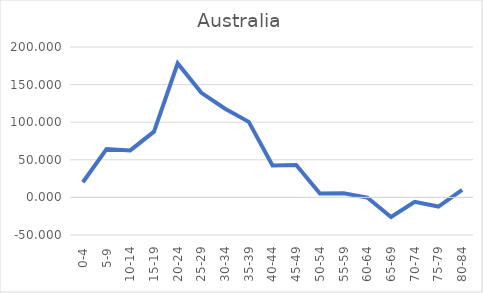
| Category | Series 0 |
|---|---|
| 0-4 | 20.117 |
| 5-9 | 64.284 |
| 10-14 | 62.511 |
| 15-19 | 87.4 |
| 20-24 | 178.189 |
| 25-29 | 139.024 |
| 30-34 | 117.969 |
| 35-39 | 100.443 |
| 40-44 | 42.534 |
| 45-49 | 43.114 |
| 50-54 | 5.261 |
| 55-59 | 5.458 |
| 60-64 | -0.158 |
| 65-69 | -26.077 |
| 70-74 | -5.917 |
| 75-79 | -12.198 |
| 80-84 | 9.963 |